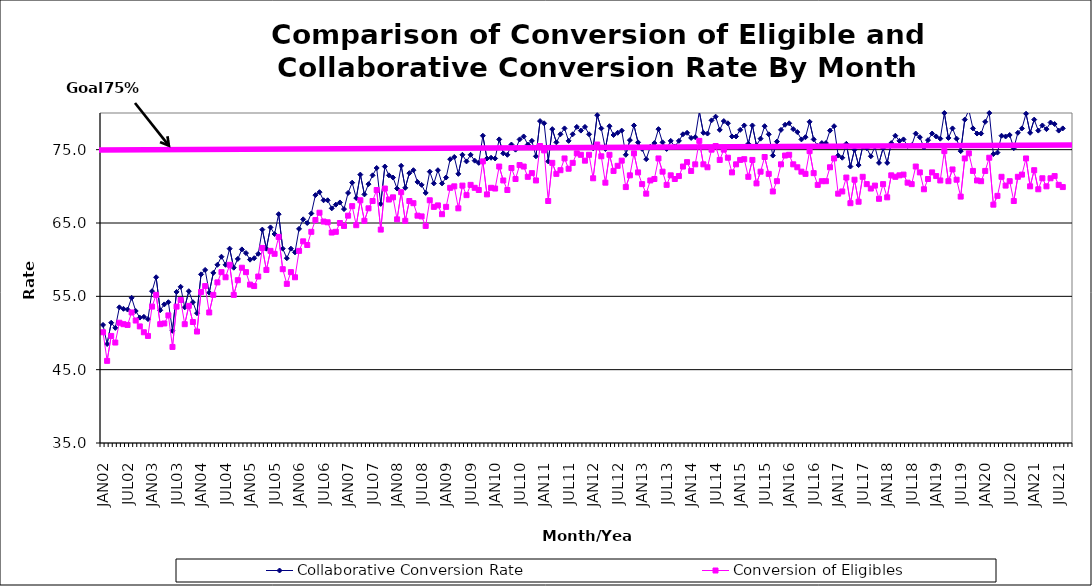
| Category | Collaborative Conversion Rate | Conversion of Eligibles |
|---|---|---|
| JAN02 | 51.1 | 50.1 |
| FEB02 | 48.5 | 46.2 |
| MAR02 | 51.4 | 49.6 |
| APR02 | 50.7 | 48.7 |
| MAY02 | 53.5 | 51.4 |
| JUN02 | 53.3 | 51.2 |
| JUL02 | 53.2 | 51.1 |
| AUG02 | 54.8 | 52.8 |
| SEP02 | 53 | 51.7 |
| OCT02 | 52.1 | 50.9 |
| NOV02 | 52.2 | 50.1 |
| DEC02 | 51.9 | 49.6 |
| JAN03 | 55.7 | 53.6 |
| FEB03 | 57.6 | 55.2 |
| MAR03 | 53.1 | 51.2 |
| APR03 | 53.9 | 51.3 |
| MAY03 | 54.2 | 52.4 |
| JUN03 | 50.3 | 48.1 |
| JUL03 | 55.6 | 53.6 |
| AUG03 | 56.3 | 54.5 |
| SEP03 | 53.5 | 51.2 |
| OCT03 | 55.7 | 53.7 |
| NOV03 | 54.2 | 51.5 |
| DEC03 | 52.7 | 50.2 |
| JAN04 | 58 | 55.6 |
| FEB04 | 58.6 | 56.4 |
| MAR04 | 55.5 | 52.8 |
| APR04 | 58.2 | 55.2 |
| MAY04 | 59.3 | 56.9 |
| JUN04 | 60.4 | 58.3 |
| JUL04 | 59.3 | 57.6 |
| AUG04 | 61.5 | 59.3 |
| SEP04 | 58.9 | 55.2 |
| OCT04 | 60.1 | 57.2 |
| NOV04 | 61.4 | 58.9 |
| DEC04 | 60.9 | 58.3 |
| JAN05 | 60 | 56.6 |
| FEB05 | 60.2 | 56.4 |
| MAR05 | 60.8 | 57.7 |
| APR05 | 64.1 | 61.6 |
| MAY05 | 61.5 | 58.6 |
| JUN05 | 64.4 | 61.2 |
| JUL05 | 63.5 | 60.8 |
| AUG05 | 66.2 | 63.1 |
| SEP05 | 61.5 | 58.7 |
| OCT05 | 60.2 | 56.7 |
| NOV05 | 61.5 | 58.3 |
| DEC05 | 61 | 57.6 |
| JAN06 | 64.2 | 61.2 |
| FEB06 | 65.5 | 62.5 |
| MAR06 | 65 | 62 |
| APR06 | 66.3 | 63.8 |
| MAY06 | 68.8 | 65.4 |
| JUN06 | 69.2 | 66.4 |
| JUL06 | 68.1 | 65.2 |
| AUG06 | 68.1 | 65.1 |
| SEP06 | 67 | 63.7 |
| OCT06 | 67.5 | 63.8 |
| NOV06 | 67.8 | 65 |
| DEC06 | 66.9 | 64.6 |
| JAN07 | 69.1 | 66 |
| FEB07 | 70.5 | 67.3 |
| MAR07 | 68.4 | 64.7 |
| APR07 | 71.6 | 68.1 |
| MAY07 | 68.9 | 65.3 |
| JUN07 | 70.3 | 67 |
| JUL07 | 71.5 | 68 |
| AUG07 | 72.5 | 69.5 |
| SEP07 | 67.6 | 64.1 |
| OCT07 | 72.7 | 69.7 |
| NOV07 | 71.5 | 68.2 |
| DEC07 | 71.2 | 68.5 |
| JAN08 | 69.7 | 65.5 |
| FEB08 | 72.8 | 69.2 |
| MAR08 | 69.8 | 65.3 |
| APR08 | 71.8 | 68 |
| MAY08 | 72.2 | 67.7 |
| JUN08 | 70.6 | 66 |
| JUL08 | 70.2 | 65.9 |
| AUG08 | 69.1 | 64.6 |
| SEP08 | 72 | 68.1 |
| OCT08 | 70.4 | 67.2 |
| NOV08 | 72.2 | 67.4 |
| DEC08 | 70.4 | 66.2 |
| JAN09 | 71.2 | 67.2 |
| FEB09 | 73.7 | 69.8 |
| MAR09 | 74 | 70 |
| APR09 | 71.7 | 67 |
| MAY09 | 74.3 | 70.1 |
| JUN09 | 73.4 | 68.8 |
| JUL09 | 74.3 | 70.2 |
| AUG09 | 73.5 | 69.8 |
| SEP09 | 73.2 | 69.5 |
| OCT09 | 76.9 | 73.4 |
| NOV09 | 73.8 | 68.9 |
| DEC09 | 73.9 | 69.8 |
| JAN10 | 73.8 | 69.7 |
| FEB10 | 76.4 | 72.7 |
| MAR10 | 74.5 | 70.8 |
| APR10 | 74.3 | 69.5 |
| MAY10 | 75.7 | 72.5 |
| JUN10 | 75 | 71 |
| JUL10 | 76.4 | 72.9 |
| AUG10 | 76.8 | 72.7 |
| SEP10 | 75.7 | 71.3 |
| OCT10 | 76.2 | 71.8 |
| NOV10 | 74.1 | 70.8 |
| DEC10 | 78.9 | 75.5 |
| JAN11 | 78.6 | 74.9 |
| FEB11 | 73.4 | 68 |
| MAR11 | 77.8 | 73.2 |
| APR11 | 76 | 71.7 |
| MAY11 | 77.1 | 72.2 |
| JUN11 | 77.9 | 73.8 |
| JUL11 | 76.2 | 72.4 |
| AUG11 | 77.1 | 73.2 |
| SEP11 | 78.1 | 74.5 |
| OCT11 | 77.6 | 74.3 |
| NOV11 | 78.1 | 73.5 |
| DEC11 | 77.1 | 74.3 |
| JAN12 | 75.2 | 71.1 |
| FEB12 | 79.7 | 75.7 |
| MAR12 | 77.9 | 74.1 |
| APR12 | 75.1 | 70.5 |
| MAY12 | 78.2 | 74.3 |
| JUN12 | 77 | 72.1 |
| JUL12 | 77.3 | 72.8 |
| AUG12 | 77.6 | 73.5 |
| SEP12 | 74.3 | 69.9 |
| OCT12 | 76.3 | 71.5 |
| NOV12 | 78.3 | 74.5 |
| DEC12 | 76 | 71.9 |
| JAN13 | 75.1 | 70.3 |
| FEB13 | 73.7 | 69 |
| MAR13 | 75.4 | 70.8 |
| APR13 | 75.9 | 71 |
| MAY13 | 77.8 | 73.8 |
| JUN13 | 76 | 72 |
| JUL13 | 75.1 | 70.2 |
| AUG13 | 76.2 | 71.5 |
| SEP13 | 75.4 | 71 |
| OCT13 | 76.2 | 71.4 |
| NOV13 | 77.1 | 72.7 |
| DEC13 | 77.3 | 73.3 |
| JAN14 | 76.6 | 72.1 |
| FEB14 | 76.7 | 73 |
| MAR14 | 80.2 | 76.2 |
| APR14 | 77.3 | 73 |
| MAY14 | 77.2 | 72.6 |
| JUN14 | 79 | 75 |
| JUL14 | 79.5 | 75.5 |
| AUG14 | 77.7 | 73.6 |
| SEP14 | 78.9 | 75 |
| OCT14 | 78.6 | 73.9 |
| NOV14 | 76.8 | 71.9 |
| DEC14 | 76.8 | 73 |
| JAN15 | 77.7 | 73.6 |
| FEB15 | 78.3 | 73.7 |
| MAR15 | 75.8 | 71.3 |
| APR15 | 78.3 | 73.6 |
| MAY15 | 75.6 | 70.4 |
| JUN15 | 76.5 | 72 |
| JUL15 | 78.2 | 74 |
| AUG15 | 77.1 | 71.7 |
| SEP15 | 74.2 | 69.3 |
| OCT15 | 76.1 | 70.7 |
| NOV15 | 77.7 | 73 |
| DEC15 | 78.4 | 74.2 |
| JAN16 | 78.6 | 74.3 |
| FEB16 | 77.8 | 73 |
| MAR16 | 77.4 | 72.6 |
| APR16 | 76.4 | 72 |
| MAY16 | 76.7 | 71.7 |
| JUN16 | 78.8 | 74.8 |
| JUL16 | 76.4 | 71.8 |
| AUG16 | 75.5 | 70.2 |
| SEP16 | 75.9 | 70.7 |
| OCT16 | 75.9 | 70.7 |
| NOV16 | 77.6 | 72.6 |
| DEC16 | 78.2 | 73.8 |
| JAN17 | 74.2 | 69 |
| FEB17 | 73.9 | 69.3 |
| MAR17 | 75.8 | 71.2 |
| APR17 | 72.7 | 67.7 |
| MAY17 | 75 | 70.9 |
| JUN17 | 72.9 | 67.9 |
| JUL17 | 75.4 | 71.3 |
| AUG17 | 75.2 | 70.3 |
| SEP17 | 74.1 | 69.7 |
| OCT17 | 75.4 | 70.1 |
| NOV17 | 73.2 | 68.3 |
| DEC17 | 75.2 | 70.3 |
| JAN18 | 73.2 | 68.5 |
| FEB18 | 75.9 | 71.5 |
| MAR18 | 76.9 | 71.3 |
| APR18 | 76.2 | 71.5 |
| MAY18 | 76.4 | 71.6 |
| JUN18 | 75.5 | 70.5 |
| JUL18 | 75.6 | 70.3 |
| AUG18 | 77.2 | 72.7 |
| SEP18 | 76.7 | 71.9 |
| OCT18 | 75.3 | 69.6 |
| NOV18 | 76.3 | 71 |
| DEC18 | 77.2 | 71.9 |
| JAN19 | 76.8 | 71.4 |
| FEB19 | 76.5 | 70.8 |
| MAR19 | 80 | 74.8 |
| APR19 | 76.6 | 70.7 |
| MAY19 | 77.9 | 72.3 |
| JUN19 | 76.5 | 70.9 |
| JUL19 | 74.8 | 68.6 |
| AUG19 | 79.1 | 73.8 |
| SEP19 | 80.4 | 74.5 |
| OCT19 | 77.9 | 72.1 |
| NOV19 | 77.2 | 70.8 |
| DEC19 | 77.2 | 70.7 |
| JAN20 | 78.8 | 72.1 |
| FEB20 | 80 | 73.9 |
| MAR20 | 74.4 | 67.5 |
| APR20 | 74.6 | 68.7 |
| MAY20 | 76.9 | 71.3 |
| JUN20 | 76.8 | 70.1 |
| JUL20 | 77 | 70.7 |
| AUG20 | 75.2 | 68 |
| SEP20 | 77.3 | 71.3 |
| OCT20 | 77.9 | 71.6 |
| NOV20 | 79.9 | 73.8 |
| DEC20 | 77.3 | 70 |
| JAN21 | 79.1 | 72.2 |
| FEB21 | 77.6 | 69.6 |
| MAR21 | 78.3 | 71.1 |
| APR21 | 77.8 | 70 |
| MAY21 | 78.7 | 71.1 |
| JUN21 | 78.5 | 71.4 |
| JUL21 | 77.6 | 70.2 |
| AUG21 | 77.9 | 69.9 |